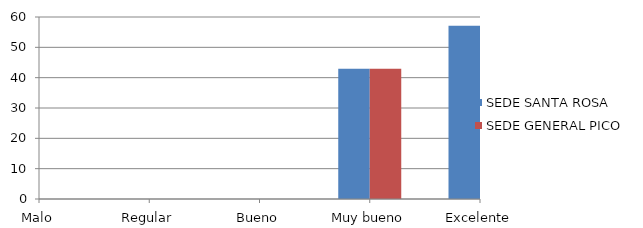
| Category | SEDE SANTA ROSA | SEDE GENERAL PICO |
|---|---|---|
| Malo | 0 | 0 |
| Regular | 0 | 0 |
| Bueno | 0 | 0 |
| Muy bueno | 42.9 | 42.9 |
| Excelente | 57.1 | 57.1 |